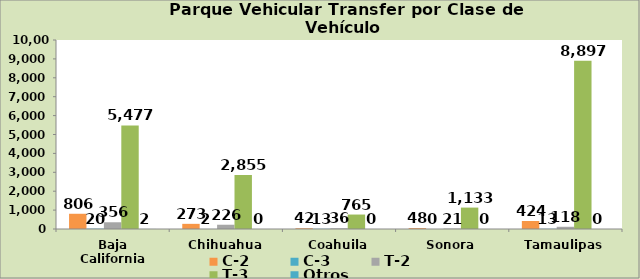
| Category | C-2 | C-3 | T-2 | T-3 | Otros |
|---|---|---|---|---|---|
| Baja California | 806 | 20 | 356 | 5477 | 2 |
| Chihuahua | 273 | 2 | 226 | 2855 | 0 |
| Coahuila | 42 | 13 | 36 | 765 | 0 |
| Sonora | 48 | 0 | 21 | 1133 | 0 |
| Tamaulipas | 424 | 13 | 118 | 8897 | 0 |